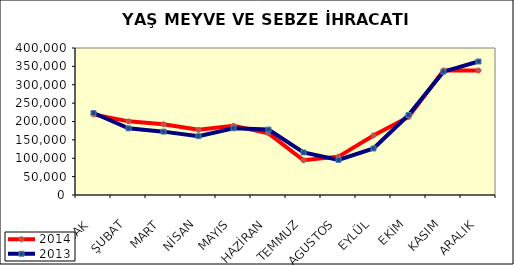
| Category | 2014 | 2013 |
|---|---|---|
| OCAK | 219372.686 | 223131.927 |
| ŞUBAT | 200366.002 | 181369.864 |
| MART | 192356.901 | 172416.706 |
| NİSAN | 177392.704 | 160129.841 |
| MAYIS | 188104.702 | 181562.632 |
| HAZİRAN | 167816.563 | 178000.419 |
| TEMMUZ | 94589.399 | 115847.714 |
| AGUSTOS | 104390.125 | 95304.603 |
| EYLÜL | 162033.476 | 126573.582 |
| EKİM | 212504.176 | 217579.892 |
| KASIM | 338884.786 | 335719.494 |
| ARALIK | 338705.548 | 363333.532 |